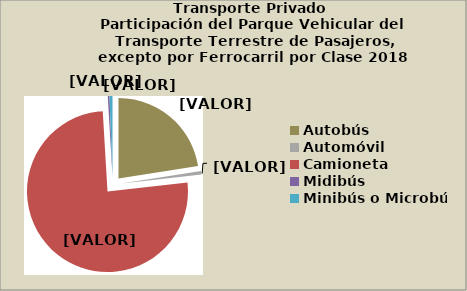
| Category | Series 0 |
|---|---|
| Autobús | 22.536 |
| Automóvil | 0.672 |
| Camioneta | 75.853 |
| Midibús | 0.349 |
| Minibús o Microbús | 0.591 |